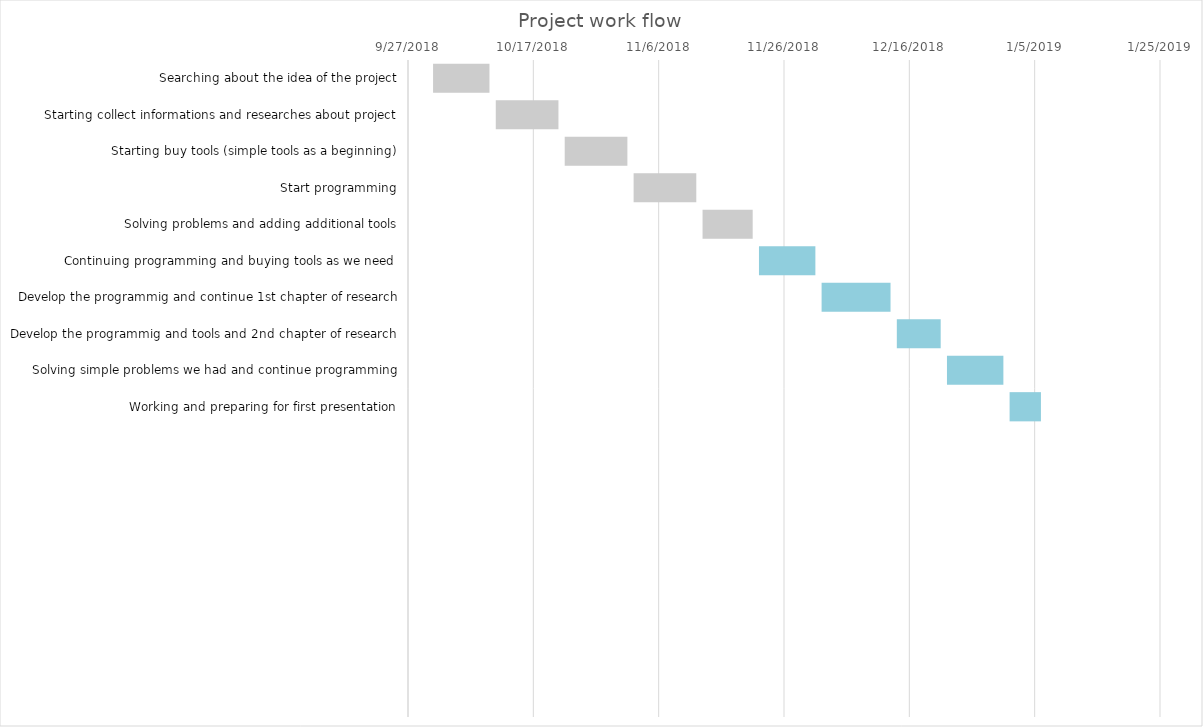
| Category | Start Dates | Duration |
|---|---|---|
| Searching about the idea of the project | 10/1/18 | 9 |
| Starting collect informations and researches about project | 10/11/18 | 10 |
| Starting buy tools (simple tools as a beginning) | 10/22/18 | 10 |
| Start programming | 11/2/18 | 10 |
| Solving problems and adding additional tools | 11/13/18 | 8 |
| Continuing programming and buying tools as we need  | 11/22/18 | 9 |
| Develop the programmig and continue 1st chapter of research | 12/2/18 | 11 |
| Develop the programmig and tools and 2nd chapter of research | 12/14/18 | 7 |
| Solving simple problems we had and continue programming | 12/22/18 | 9 |
| Working and preparing for first presentation | 1/1/19 | 5 |